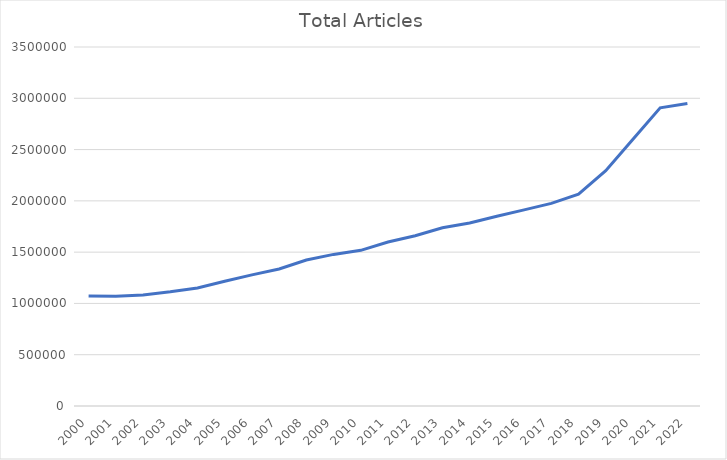
| Category | Total Articles |
|---|---|
| 2000.0 | 1073538 |
| 2001.0 | 1068877 |
| 2002.0 | 1083319 |
| 2003.0 | 1112814 |
| 2004.0 | 1150333 |
| 2005.0 | 1215488 |
| 2006.0 | 1278484 |
| 2007.0 | 1336372 |
| 2008.0 | 1422880 |
| 2009.0 | 1478022 |
| 2010.0 | 1517506 |
| 2011.0 | 1599429 |
| 2012.0 | 1660107 |
| 2013.0 | 1738184 |
| 2014.0 | 1784544 |
| 2015.0 | 1850414 |
| 2016.0 | 1912308 |
| 2017.0 | 1975738 |
| 2018.0 | 2065900 |
| 2019.0 | 2294683 |
| 2020.0 | 2601081 |
| 2021.0 | 2907439 |
| 2022.0 | 2949366 |